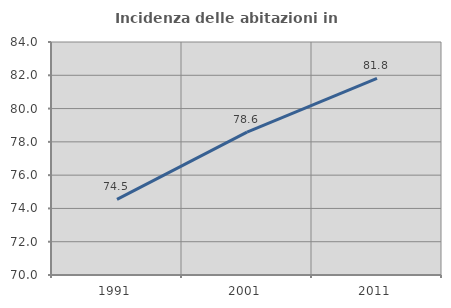
| Category | Incidenza delle abitazioni in proprietà  |
|---|---|
| 1991.0 | 74.548 |
| 2001.0 | 78.581 |
| 2011.0 | 81.811 |